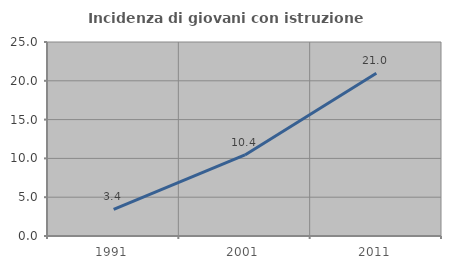
| Category | Incidenza di giovani con istruzione universitaria |
|---|---|
| 1991.0 | 3.429 |
| 2001.0 | 10.443 |
| 2011.0 | 20.971 |